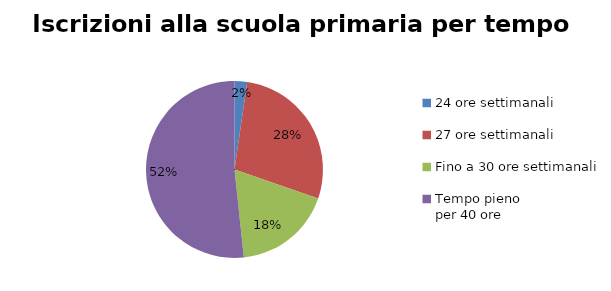
| Category | Series 0 |
|---|---|
| 24 ore settimanali | 874 |
| 27 ore settimanali | 10666 |
| Fino a 30 ore settimanali | 6864 |
| Tempo pieno 
per 40 ore | 19687 |